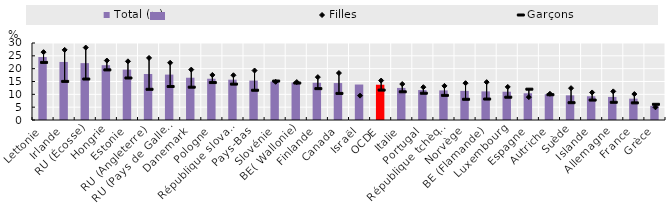
| Category | Total (↘) |
|---|---|
| Lettonie | 24.529 |
| Irlande | 22.621 |
| RU (Écosse) | 22.158 |
| Hongrie | 21.356 |
| Estonie | 19.623 |
| RU (Angleterre) | 17.925 |
| RU (Pays de Galles) | 17.693 |
| Danemark | 16.468 |
| Pologne | 16.075 |
| République slovaque | 15.715 |
| Pays-Bas | 15.356 |
| Slovénie | 15.022 |
| BE( Wallonie) | 14.594 |
| Finlande | 14.503 |
| Canada | 14.387 |
| Israël | 13.821 |
| OCDE | 13.738 |
| Italie | 12.503 |
| Portugal | 11.662 |
| République tchèque | 11.532 |
| Norvège | 11.342 |
| BE (Flamande) | 11.151 |
| Luxembourg | 11.024 |
| Espagne | 10.42 |
| Autriche | 10.045 |
| Suède | 9.609 |
| Islande | 9.254 |
| Allemagne | 8.992 |
| France | 8.317 |
| Grèce | 5.524 |